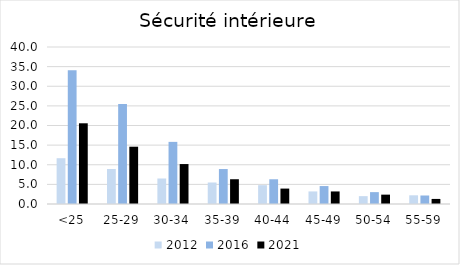
| Category | 2012 | 2016 | 2021 |
|---|---|---|---|
| <25 | 11.666 | 34.101 | 20.563 |
| 25-29 | 8.917 | 25.497 | 14.598 |
| 30-34 | 6.496 | 15.828 | 10.177 |
| 35-39 | 5.479 | 8.905 | 6.309 |
| 40-44 | 4.796 | 6.301 | 3.929 |
| 45-49 | 3.202 | 4.572 | 3.199 |
| 50-54 | 2.002 | 3.024 | 2.384 |
| 55-59 | 2.216 | 2.166 | 1.293 |